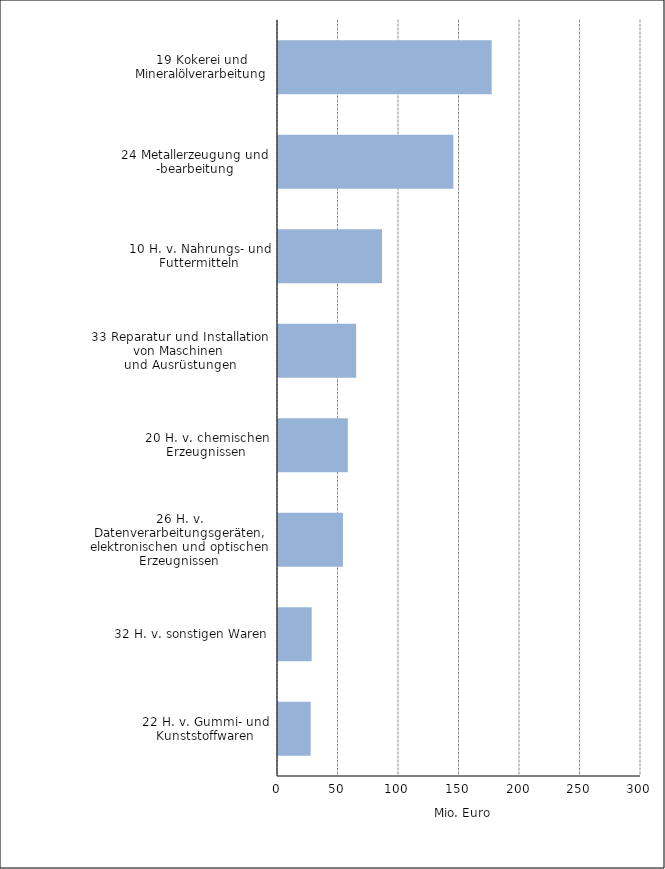
| Category | Mio. Euro |
|---|---|
| 19 Kokerei und Mineralölverarbeitung | 176.594 |
| 24 Metallerzeugung und -bearbeitung | 144.916 |
| 10 H. v. Nahrungs- und Futtermitteln | 85.984 |
| 33 Reparatur und Installation von Maschinen 
und Ausrüstungen | 64.591 |
| 20 H. v. chemischen Erzeugnissen | 57.73 |
| 26 H. v. Datenverarbeitungsgeräten, elektronischen und optischen Erzeugnissen | 53.68 |
| 32 H. v. sonstigen Waren | 27.816 |
| 22 H. v. Gummi- und Kunststoffwaren | 26.983 |